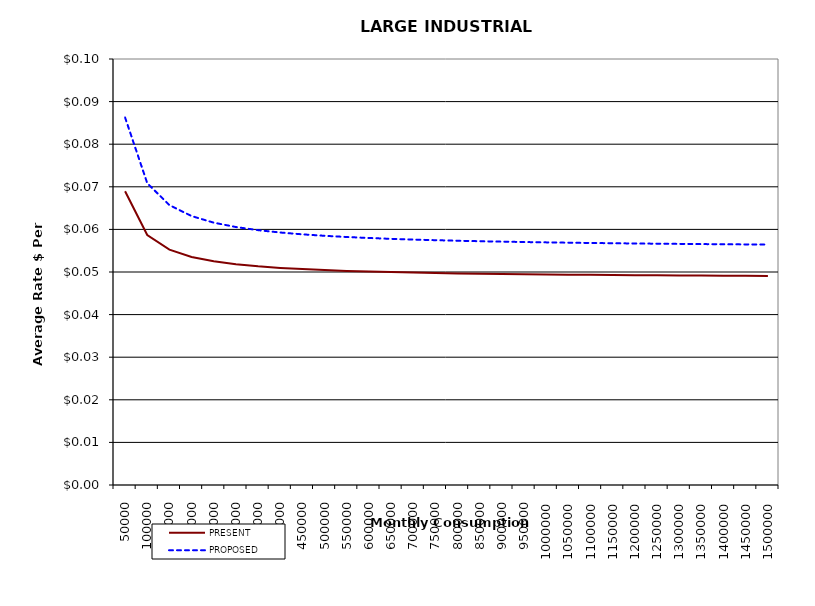
| Category | PRESENT | PROPOSED |
|---|---|---|
| 50000.0 | 0.069 | 0.086 |
| 100000.0 | 0.059 | 0.071 |
| 150000.0 | 0.055 | 0.066 |
| 200000.0 | 0.054 | 0.063 |
| 250000.0 | 0.053 | 0.062 |
| 300000.0 | 0.052 | 0.061 |
| 350000.0 | 0.051 | 0.06 |
| 400000.0 | 0.051 | 0.059 |
| 450000.0 | 0.051 | 0.059 |
| 500000.0 | 0.05 | 0.058 |
| 550000.0 | 0.05 | 0.058 |
| 600000.0 | 0.05 | 0.058 |
| 650000.0 | 0.05 | 0.058 |
| 700000.0 | 0.05 | 0.058 |
| 750000.0 | 0.05 | 0.057 |
| 800000.0 | 0.05 | 0.057 |
| 850000.0 | 0.05 | 0.057 |
| 900000.0 | 0.05 | 0.057 |
| 950000.0 | 0.049 | 0.057 |
| 1000000.0 | 0.049 | 0.057 |
| 1050000.0 | 0.049 | 0.057 |
| 1100000.0 | 0.049 | 0.057 |
| 1150000.0 | 0.049 | 0.057 |
| 1200000.0 | 0.049 | 0.057 |
| 1250000.0 | 0.049 | 0.057 |
| 1300000.0 | 0.049 | 0.057 |
| 1350000.0 | 0.049 | 0.057 |
| 1400000.0 | 0.049 | 0.057 |
| 1450000.0 | 0.049 | 0.056 |
| 1500000.0 | 0.049 | 0.056 |